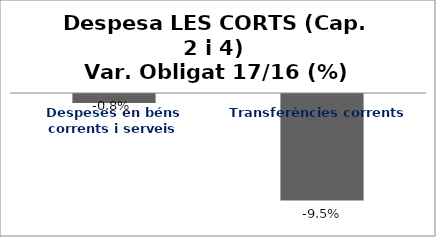
| Category | Series 0 |
|---|---|
| Despeses en béns corrents i serveis | -0.008 |
| Transferències corrents | -0.095 |